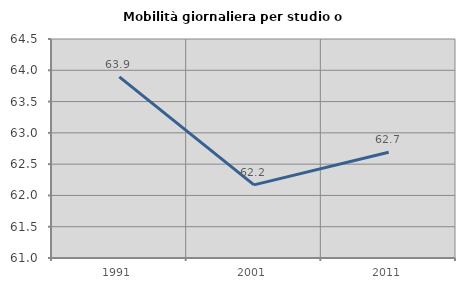
| Category | Mobilità giornaliera per studio o lavoro |
|---|---|
| 1991.0 | 63.896 |
| 2001.0 | 62.169 |
| 2011.0 | 62.689 |